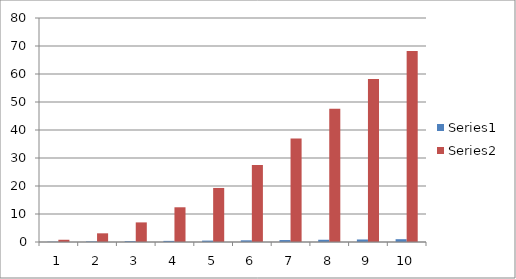
| Category | Series 0 | Series 1 |
|---|---|---|
| 0 | 0.1 | 0.8 |
| 1 | 0.2 | 3.1 |
| 2 | 0.3 | 7 |
| 3 | 0.4 | 12.4 |
| 4 | 0.5 | 19.3 |
| 5 | 0.6 | 27.5 |
| 6 | 0.7 | 37 |
| 7 | 0.8 | 47.6 |
| 8 | 0.9 | 58.2 |
| 9 | 1 | 68.2 |